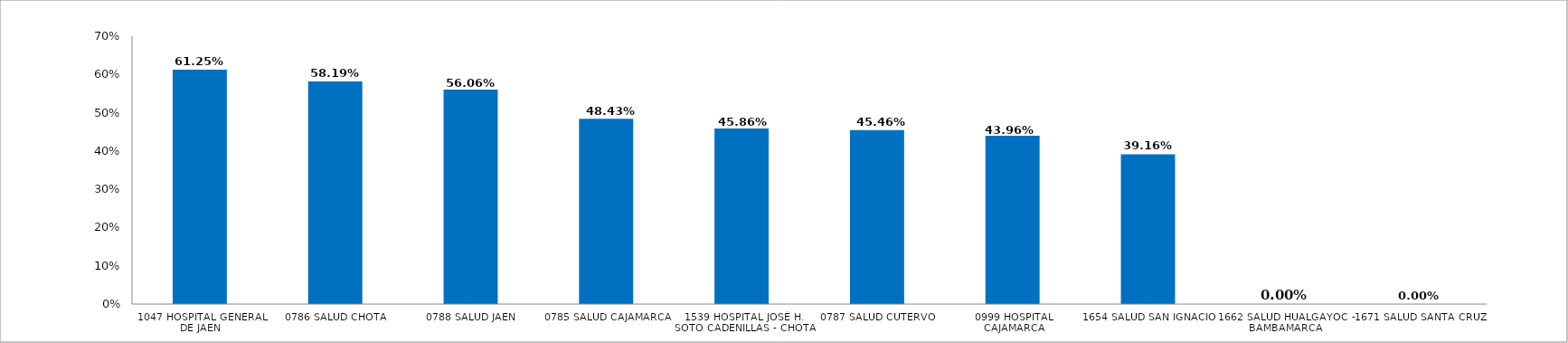
| Category | % EJECUCIÓN  |
|---|---|
| 1047 HOSPITAL GENERAL DE JAEN | 0.612 |
| 0786 SALUD CHOTA | 0.582 |
| 0788 SALUD JAEN | 0.561 |
| 0785 SALUD CAJAMARCA | 0.484 |
| 1539 HOSPITAL JOSÉ H. SOTO CADENILLAS - CHOTA | 0.459 |
| 0787 SALUD CUTERVO | 0.455 |
| 0999 HOSPITAL CAJAMARCA | 0.44 |
| 1654 SALUD SAN IGNACIO | 0.392 |
| 1662 SALUD HUALGAYOC - BAMBAMARCA | 0 |
| 1671 SALUD SANTA CRUZ | 0 |